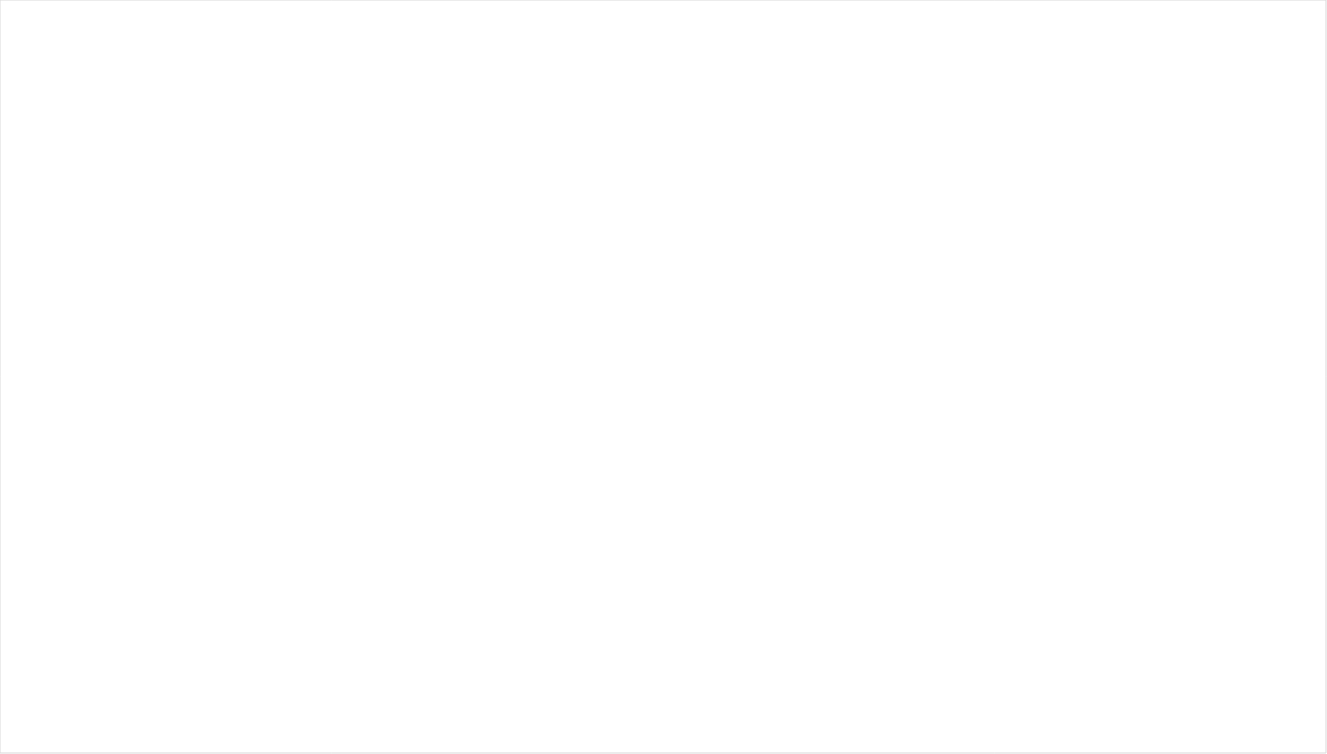
| Category | Sum of Sum of Start if - | Sum of Sum of Start if + | Sum of Sum of Flowering Duration | Sum of Sum of Full Bloom | Sum of Sum of Days until end |
|---|---|---|---|---|---|
| Butte | 0 | 3 | 18 | 1 | 10.5 |
| Padre | 0 | 4 | 16 | 1 | 13.5 |
| Livingston | 0 | 1 | 18 | 1 | 13.5 |
| Mira | 0 | 5 | 12 | 1 | 11.5 |
| Almond 13 | 0 | 7 | 9 | 1 | 15.5 |
| Maxima | 0 | 6.5 | 8 | 1 | 15 |
| Carmel | 0 | 0.5 | 13.5 | 1 | 12 |
| Capella | 0 | 1 | 12 | 1 | 14.5 |
| Wood Colony | 0 | 0 | 13 | 1 | 13.5 |
| Nonpareil | 0 | 0 | 11 | 1 | 14.5 |
| Vela | -1 | 0 | 10.5 | 1 | 11 |
| Carina | -1 | 0 | 10 | 1 | 12.5 |
| Price | -1 | 0 | 10 | 1 | 10.5 |
| Monterey | -3 | 0 | 9 | 1 | 15.5 |
| Avalon | -7 | 0 | 9 | 1 | 8.5 |
| Almond 12 | -3.5 | 0 | 8.5 | 1 | 15.5 |
| Rhea | -4 | 0 | 8 | 1 | 15.5 |
| Sonora | -8 | 0 | 8 | 1 | 8.5 |
| Peerless | -5 | 0 | 6 | 1 | 12 |